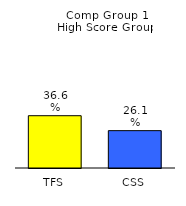
| Category | Series 0 |
|---|---|
| TFS | 0.366 |
| CSS | 0.261 |